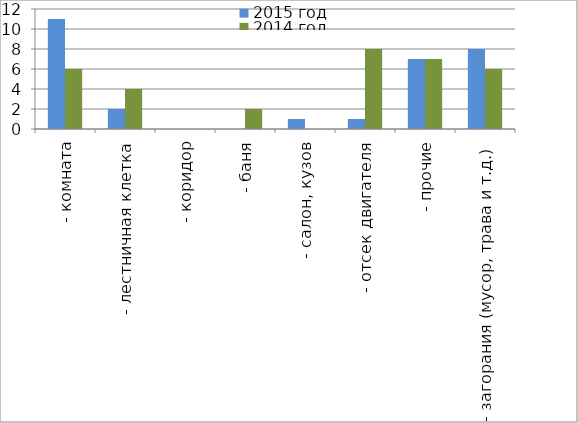
| Category | 2015 год | 2014 год |
|---|---|---|
|  - комната | 11 | 6 |
|  - лестничная клетка | 2 | 4 |
|  - коридор | 0 | 0 |
|  - баня | 0 | 2 |
|  - салон, кузов | 1 | 0 |
|  - отсек двигателя | 1 | 8 |
| - прочие | 7 | 7 |
| - загорания (мусор, трава и т.д.)  | 8 | 6 |